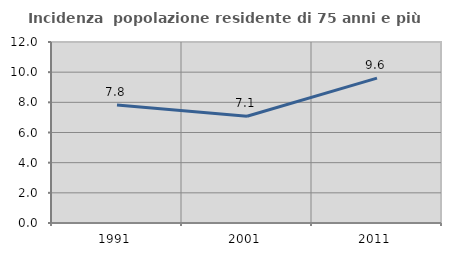
| Category | Incidenza  popolazione residente di 75 anni e più |
|---|---|
| 1991.0 | 7.822 |
| 2001.0 | 7.081 |
| 2011.0 | 9.606 |